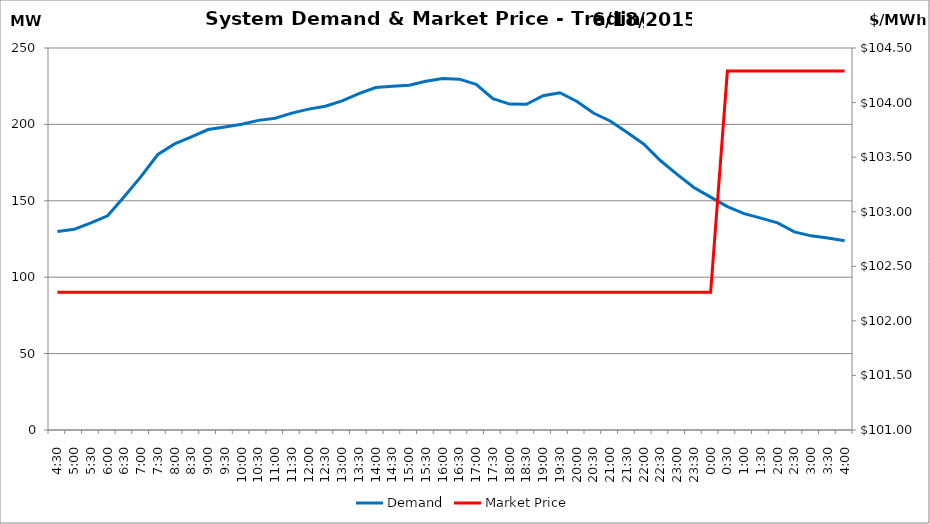
| Category | Demand |
|---|---|
| 0.1875 | 129.84 |
| 0.20833333333333334 | 131.31 |
| 0.22916666666666666 | 135.52 |
| 0.25 | 140.18 |
| 0.270833333333333 | 152.84 |
| 0.291666666666667 | 165.95 |
| 0.3125 | 180.32 |
| 0.333333333333333 | 187.26 |
| 0.354166666666667 | 191.83 |
| 0.375 | 196.64 |
| 0.395833333333333 | 198.34 |
| 0.416666666666667 | 200.15 |
| 0.4375 | 202.63 |
| 0.458333333333333 | 203.99 |
| 0.479166666666667 | 207.41 |
| 0.5 | 209.99 |
| 0.520833333333333 | 211.91 |
| 0.541666666666667 | 215.36 |
| 0.5625 | 220.16 |
| 0.583333333333333 | 224.12 |
| 0.604166666666667 | 224.91 |
| 0.625 | 225.65 |
| 0.645833333333334 | 228.26 |
| 0.666666666666667 | 230.02 |
| 0.6875 | 229.59 |
| 0.708333333333334 | 226.15 |
| 0.729166666666667 | 216.86 |
| 0.75 | 213.27 |
| 0.770833333333334 | 213.18 |
| 0.791666666666667 | 218.78 |
| 0.8125 | 220.7 |
| 0.833333333333334 | 215.2 |
| 0.854166666666667 | 207.46 |
| 0.875 | 202.22 |
| 0.895833333333334 | 194.91 |
| 0.916666666666667 | 187.19 |
| 0.9375 | 176.36 |
| 0.958333333333334 | 167.25 |
| 0.979166666666667 | 158.71 |
| 1900-01-01 | 152.38 |
| 1900-01-01 00:30:00 | 146.17 |
| 1900-01-01 01:00:00 | 141.59 |
| 1900-01-01 01:30:00 | 138.64 |
| 1900-01-01 02:00:00 | 135.59 |
| 1900-01-01 02:30:00 | 129.62 |
| 1900-01-01 03:00:00 | 127.07 |
| 1900-01-01 03:30:00 | 125.6 |
| 1900-01-01 04:00:00 | 123.88 |